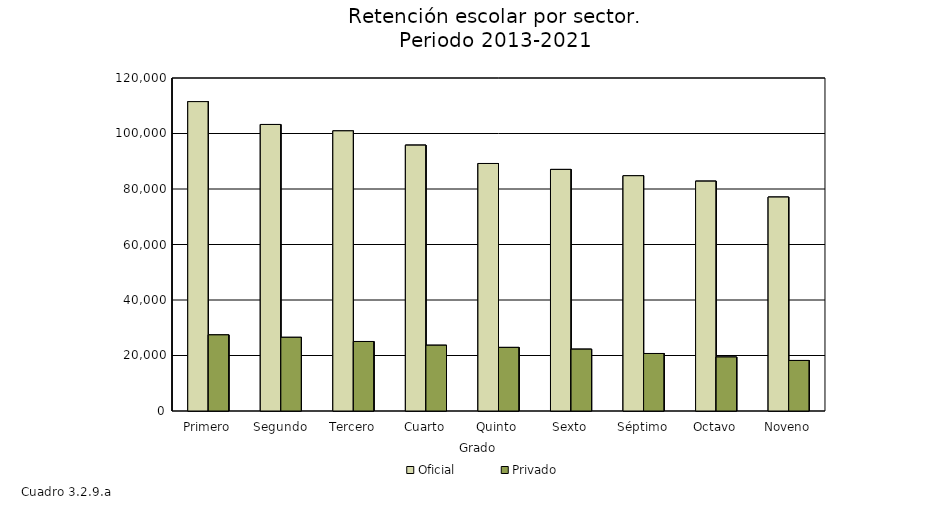
| Category | Oficial | Privado |
|---|---|---|
| Primero | 111490 | 27434 |
| Segundo | 103250 | 26546 |
| Tercero | 100955 | 25049 |
| Cuarto | 95809 | 23697 |
| Quinto | 89194 | 22912 |
| Sexto | 87051 | 22279 |
| Séptimo | 84781 | 20725 |
| Octavo | 82831 | 19454 |
| Noveno | 77090 | 18208 |